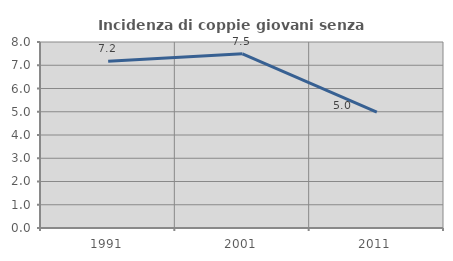
| Category | Incidenza di coppie giovani senza figli |
|---|---|
| 1991.0 | 7.168 |
| 2001.0 | 7.493 |
| 2011.0 | 4.988 |